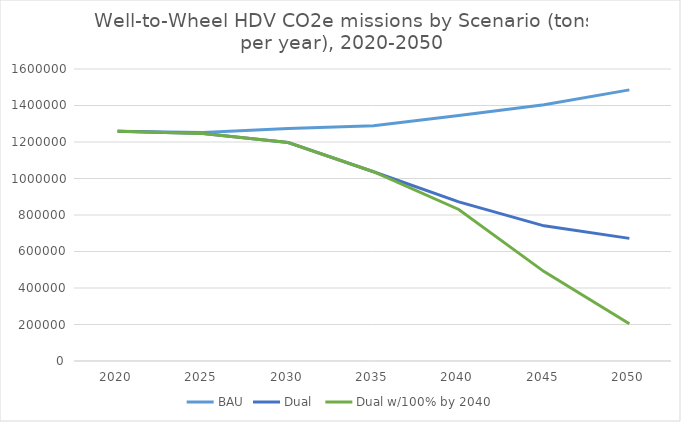
| Category | BAU | Dual  | Dual w/100% by 2040 |
|---|---|---|---|
| 2020.0 | 1259403.032 | 1259403.032 | 1259403.032 |
| 2025.0 | 1252292.322 | 1245988.886 | 1245988.886 |
| 2030.0 | 1274061.967 | 1197384.311 | 1197384.311 |
| 2035.0 | 1289657.602 | 1036971.121 | 1036971.121 |
| 2040.0 | 1344749.078 | 871890.4 | 830141.19 |
| 2045.0 | 1403784.148 | 740628.733 | 489872.744 |
| 2050.0 | 1485614.331 | 671929.987 | 204603.689 |